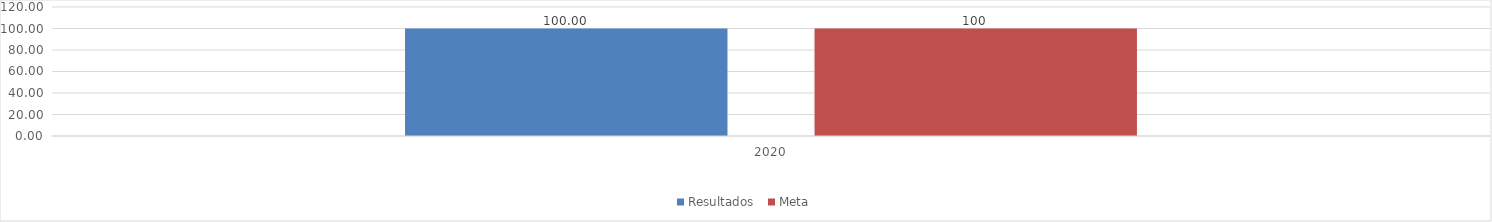
| Category | Resultados  | Meta |
|---|---|---|
| 2020 | 100 | 100 |